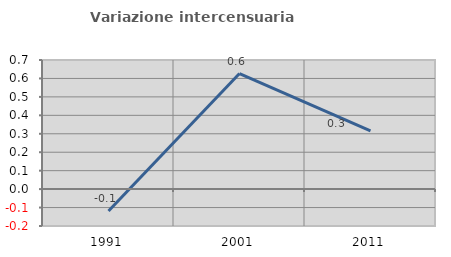
| Category | Variazione intercensuaria annua |
|---|---|
| 1991.0 | -0.119 |
| 2001.0 | 0.627 |
| 2011.0 | 0.316 |